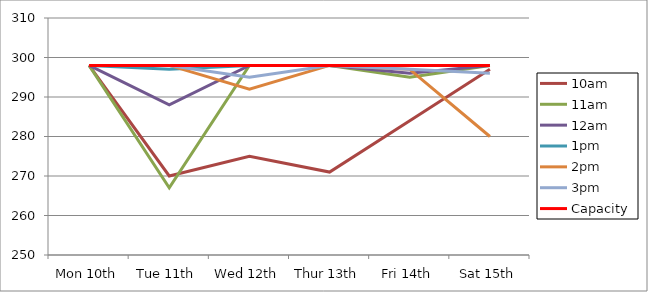
| Category | 9am | 10am | 11am | 12am | 1pm | 2pm | 3pm | 4pm | 5pm | Capacity |
|---|---|---|---|---|---|---|---|---|---|---|
| Mon 10th |  | 298 | 298 | 298 | 298 | 298 | 298 |  |  | 298 |
| Tue 11th |  | 270 | 267 | 288 | 297 | 298 | 298 |  |  | 298 |
| Wed 12th |  | 275 | 298 | 298 | 298 | 292 | 295 |  |  | 298 |
| Thur 13th |  | 271 | 298 | 298 | 298 | 298 | 298 |  |  | 298 |
| Fri 14th |  | 284 | 295 | 296 | 298 | 297 | 297 |  |  | 298 |
| Sat 15th |  | 297 | 298 | 298 | 298 | 280 | 296 |  |  | 298 |